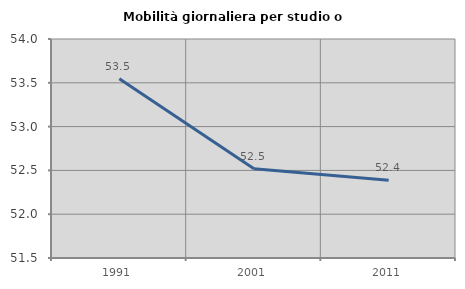
| Category | Mobilità giornaliera per studio o lavoro |
|---|---|
| 1991.0 | 53.546 |
| 2001.0 | 52.519 |
| 2011.0 | 52.389 |